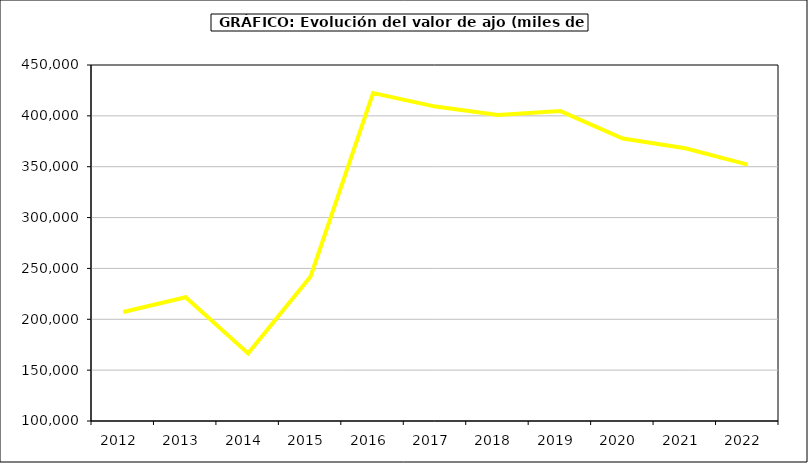
| Category | Valor |
|---|---|
| 2012.0 | 207093.401 |
| 2013.0 | 221679.276 |
| 2014.0 | 166479.754 |
| 2015.0 | 242093 |
| 2016.0 | 422317 |
| 2017.0 | 409101.11 |
| 2018.0 | 400751.73 |
| 2019.0 | 404668.729 |
| 2020.0 | 377754.157 |
| 2021.0 | 368133.018 |
| 2022.0 | 352098.096 |